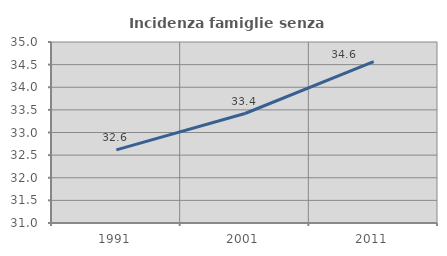
| Category | Incidenza famiglie senza nuclei |
|---|---|
| 1991.0 | 32.616 |
| 2001.0 | 33.42 |
| 2011.0 | 34.566 |